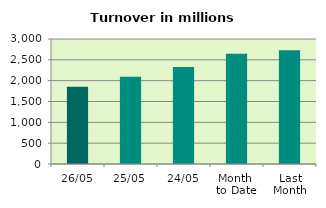
| Category | Series 0 |
|---|---|
| 26/05 | 1851.872 |
| 25/05 | 2096.161 |
| 24/05 | 2329.861 |
| Month 
to Date | 2646.937 |
| Last
Month | 2727.753 |